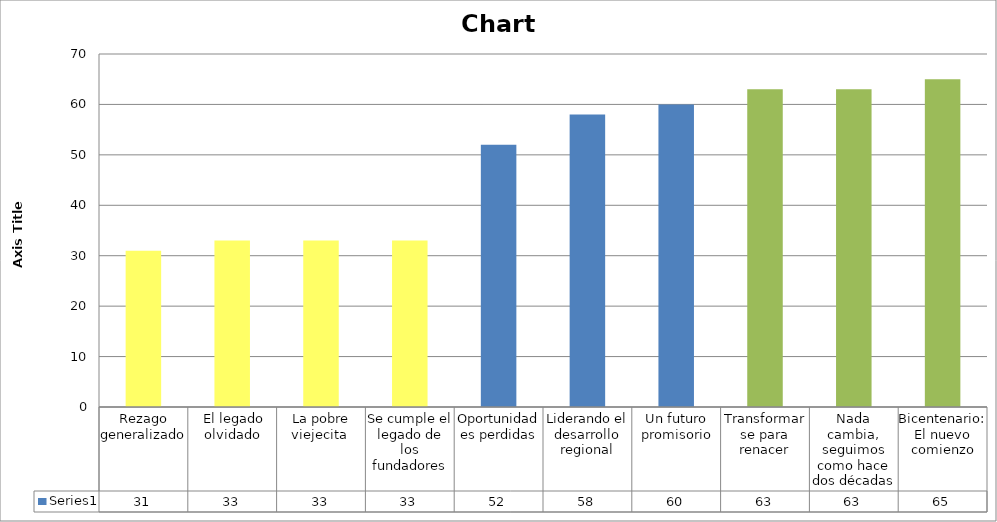
| Category | Series 0 |
|---|---|
| Rezago generalizado  | 31 |
|  El legado olvidado | 33 |
| La pobre viejecita  | 33 |
| Se cumple el legado de los fundadores | 33 |
| Oportunidades perdidas | 52 |
| Liderando el desarrollo regional | 58 |
| Un futuro promisorio | 60 |
| Transformarse para renacer | 63 |
| Nada cambia, seguimos como hace dos décadas | 63 |
| Bicentenario: El nuevo comienzo | 65 |